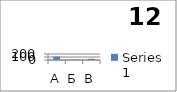
| Category | Series 0 |
|---|---|
| А | 114 |
| Б | 10 |
| В | 40 |